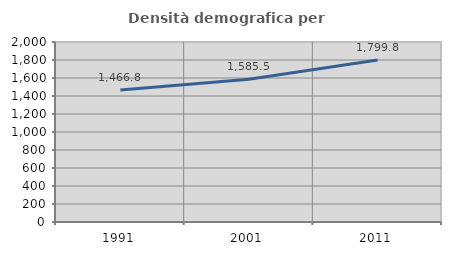
| Category | Densità demografica |
|---|---|
| 1991.0 | 1466.76 |
| 2001.0 | 1585.517 |
| 2011.0 | 1799.762 |